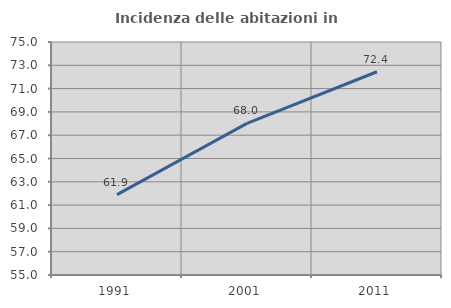
| Category | Incidenza delle abitazioni in proprietà  |
|---|---|
| 1991.0 | 61.901 |
| 2001.0 | 68.01 |
| 2011.0 | 72.447 |